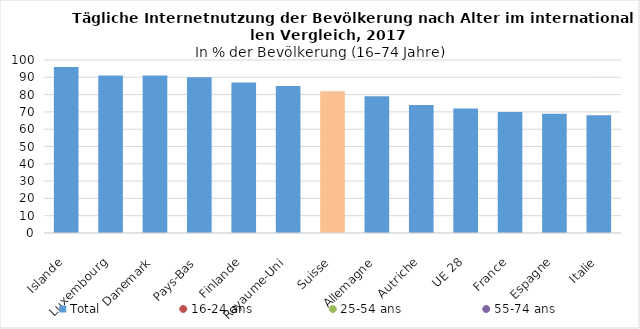
| Category | Total |
|---|---|
| Islande | 96 |
| Luxembourg | 91 |
| Danemark | 91 |
| Pays-Bas | 90 |
| Finlande | 87 |
| Royaume-Uni | 85 |
| Suisse | 82 |
| Allemagne | 79 |
| Autriche | 74 |
| UE 28 | 72 |
| France | 70 |
| Espagne | 69 |
| Italie | 68 |